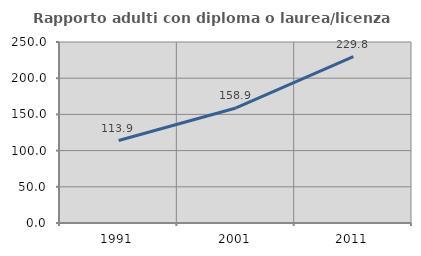
| Category | Rapporto adulti con diploma o laurea/licenza media  |
|---|---|
| 1991.0 | 113.86 |
| 2001.0 | 158.932 |
| 2011.0 | 229.768 |